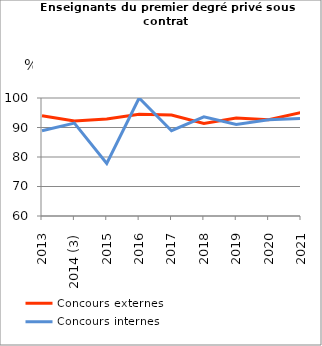
| Category | Concours externes  | Concours internes |
|---|---|---|
| 2013 | 94 | 88.9 |
| 2014 (3) | 92.2 | 91.5 |
| 2015 | 92.9 | 77.8 |
| 2016 | 94.5 | 100 |
| 2017 | 94.2 | 88.9 |
| 2018 | 91.4 | 93.6 |
| 2019 | 93.2 | 91 |
| 2020 | 92.6 | 92.6 |
| 2021 | 95.1 | 93.1 |